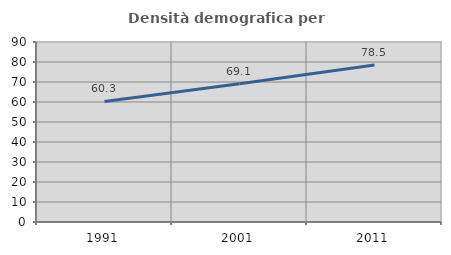
| Category | Densità demografica |
|---|---|
| 1991.0 | 60.261 |
| 2001.0 | 69.111 |
| 2011.0 | 78.506 |